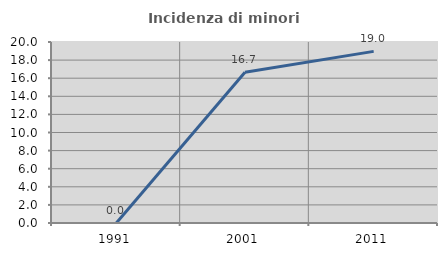
| Category | Incidenza di minori stranieri |
|---|---|
| 1991.0 | 0 |
| 2001.0 | 16.667 |
| 2011.0 | 18.966 |